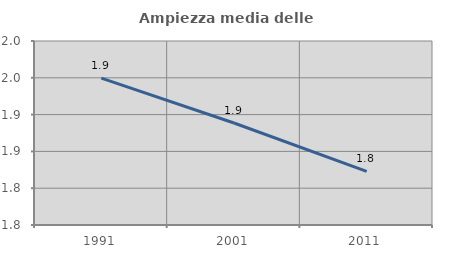
| Category | Ampiezza media delle famiglie |
|---|---|
| 1991.0 | 1.95 |
| 2001.0 | 1.889 |
| 2011.0 | 1.823 |